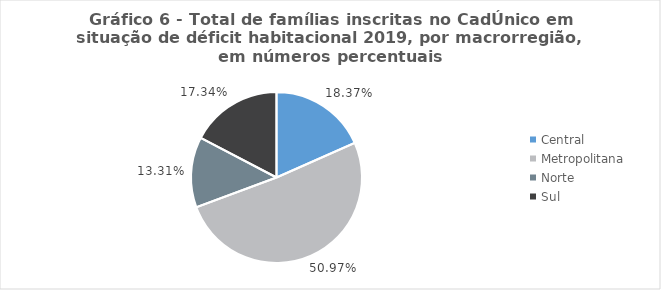
| Category | Series 0 |
|---|---|
| Central | 0.184 |
| Metropolitana | 0.51 |
| Norte | 0.133 |
| Sul | 0.173 |